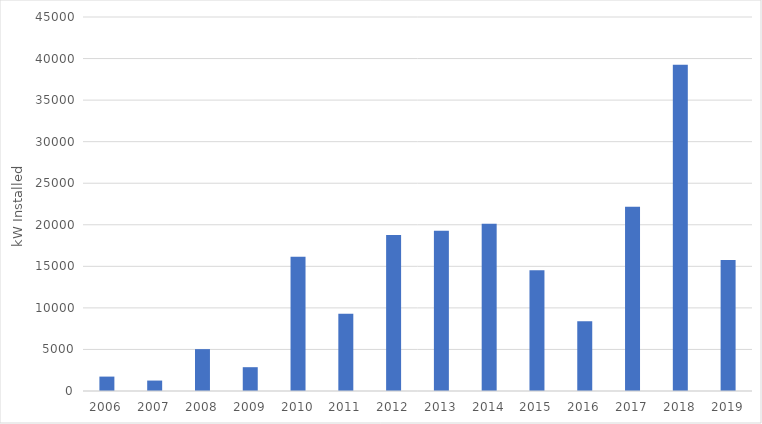
| Category | Series 0 |
|---|---|
| 2006.0 | 1733 |
| 2007.0 | 1256 |
| 2008.0 | 5039 |
| 2009.0 | 2865 |
| 2010.0 | 16144 |
| 2011.0 | 9287 |
| 2012.0 | 18760 |
| 2013.0 | 19295 |
| 2014.0 | 20124 |
| 2015.0 | 14535 |
| 2016.0 | 8394 |
| 2017.0 | 22177 |
| 2018.0 | 39256 |
| 2019.0 | 15768 |